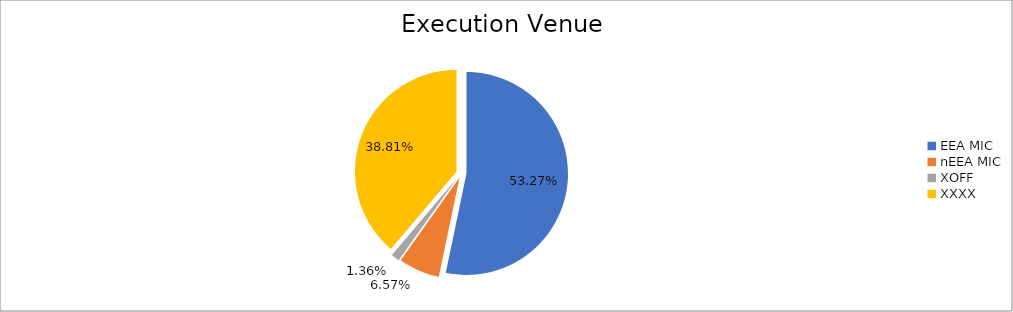
| Category | Series 0 |
|---|---|
| EEA MIC | 5751194.327 |
| nEEA MIC | 709055.994 |
| XOFF | 146381.247 |
| XXXX | 4189648.317 |